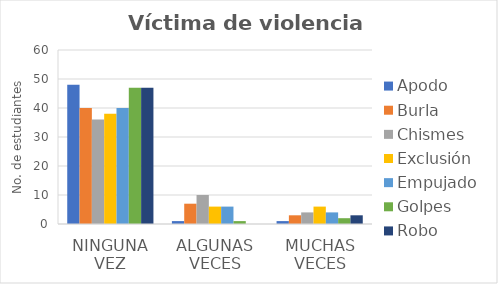
| Category | Apodo | Burla | Chismes | Exclusión | Empujado | Golpes | Robo |
|---|---|---|---|---|---|---|---|
| Ninguna vez | 48 | 40 | 36 | 38 | 40 | 47 | 47 |
| Algunas veces | 1 | 7 | 10 | 6 | 6 | 1 | 0 |
| Muchas veces | 1 | 3 | 4 | 6 | 4 | 2 | 3 |